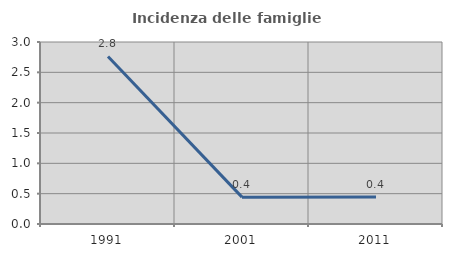
| Category | Incidenza delle famiglie numerose |
|---|---|
| 1991.0 | 2.762 |
| 2001.0 | 0.442 |
| 2011.0 | 0.444 |